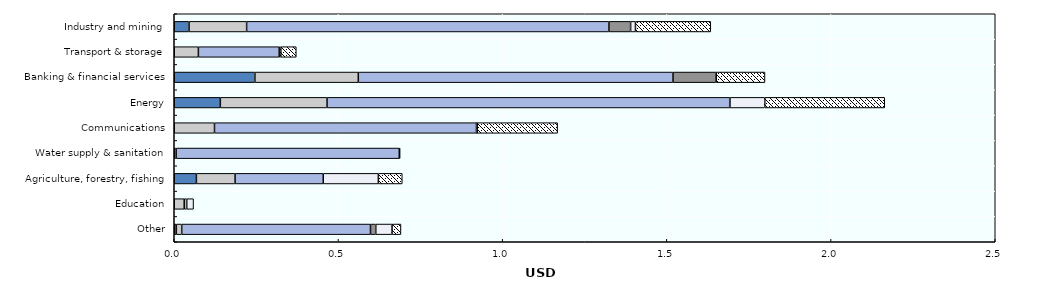
| Category | Credit lines | Direct investment in companies and SPVs | Guarantees | Shares in CIVs | Simple co-financing | Syndicated loans |
|---|---|---|---|---|---|---|
| Other | 6351773.333 | 16379918.316 | 574808632.674 | 16150992.906 | 49576084.616 | 27097872.844 |
| Education | 0 | 30376000 | 7652252.729 | 0 | 20750335.572 | 0 |
| Agriculture, forestry, fishing | 67420966.493 | 117815741.593 | 268447329.389 | 0 | 167799935.437 | 72929560 |
|  Water supply & sanitation | 0 | 5718000 | 679539166.224 | 0 | 2551951.603 | 0 |
| Communications | 0 | 122517000 | 797675618.547 | 1390625 | 1046542.777 | 244779658.33 |
| Energy | 140389281.209 | 324840579.002 | 1226236699.916 | 755018.685 | 106048084.235 | 365337855.677 |
| Banking & financial services | 245561797.756 | 314900293.224 | 958346976.188 | 130336774.771 | 1360214.001 | 148280241.265 |
| Transport & storage | 0 | 73472845.394 | 246048617.983 | 0 | 5128534.704 | 47000000 |
| Industry and mining | 45014410.332 | 175408206.335 | 1103216944.344 | 66099035.204 | 14636868.443 | 229413784.284 |